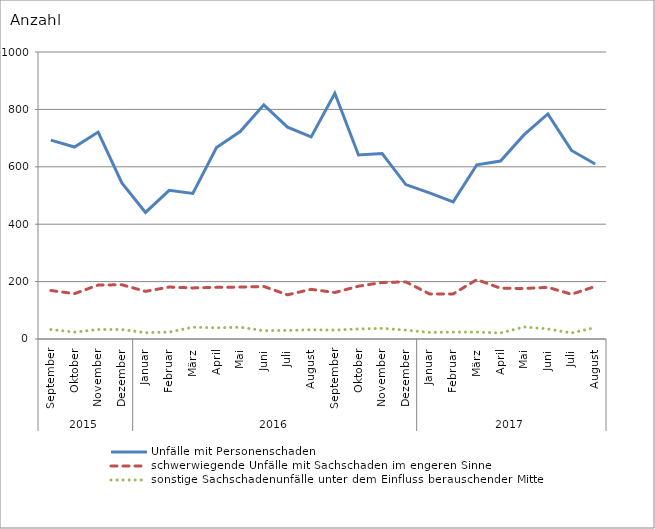
| Category | Unfälle mit Personenschaden | schwerwiegende Unfälle mit Sachschaden im engeren Sinne | sonstige Sachschadenunfälle unter dem Einfluss berauschender Mittel |
|---|---|---|---|
| 0 | 693 | 169 | 33 |
| 1 | 669 | 158 | 24 |
| 2 | 721 | 188 | 33 |
| 3 | 544 | 189 | 33 |
| 4 | 441 | 166 | 22 |
| 5 | 518 | 181 | 24 |
| 6 | 507 | 178 | 41 |
| 7 | 667 | 180 | 39 |
| 8 | 723 | 181 | 41 |
| 9 | 816 | 183 | 29 |
| 10 | 738 | 154 | 30 |
| 11 | 704 | 173 | 32 |
| 12 | 856 | 162 | 31 |
| 13 | 641 | 184 | 35 |
| 14 | 646 | 197 | 37 |
| 15 | 538 | 199 | 31 |
| 16 | 509 | 157 | 23 |
| 17 | 478 | 157 | 24 |
| 18 | 607 | 207 | 24 |
| 19 | 620 | 177 | 21 |
| 20 | 712 | 176 | 42 |
| 21 | 784 | 180 | 35 |
| 22 | 657 | 156 | 21 |
| 23 | 610 | 183 | 40 |